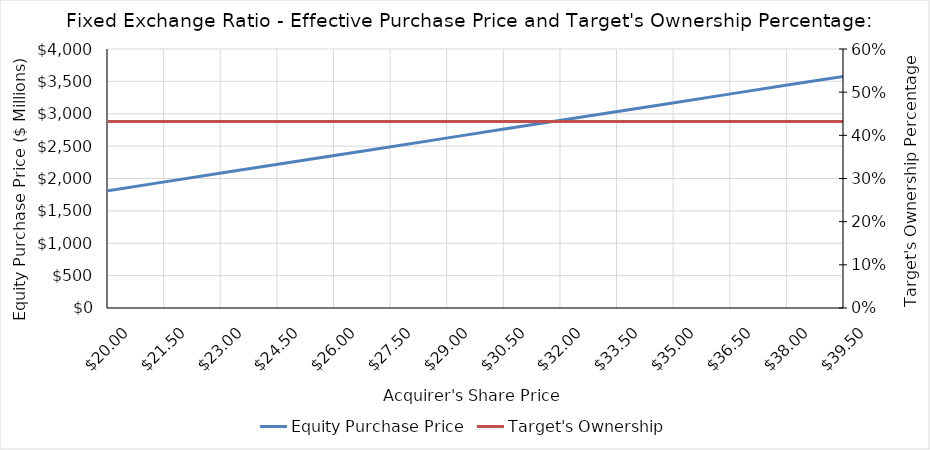
| Category | Equity Purchase Price |
|---|---|
| 20.0 | 1812.021 |
| 21.5 | 1947.923 |
| 23.0 | 2083.825 |
| 24.5 | 2219.726 |
| 26.0 | 2355.628 |
| 27.5 | 2491.529 |
| 29.0 | 2627.431 |
| 30.5 | 2763.333 |
| 32.0 | 2899.234 |
| 33.5 | 3035.136 |
| 35.0 | 3171.037 |
| 36.5 | 3306.939 |
| 38.0 | 3442.841 |
| 39.5 | 3578.742 |